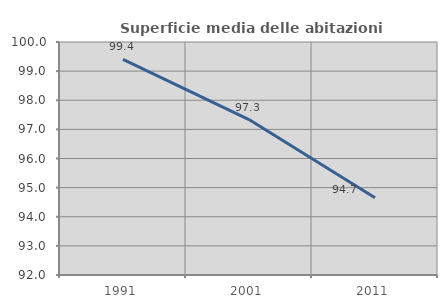
| Category | Superficie media delle abitazioni occupate |
|---|---|
| 1991.0 | 99.405 |
| 2001.0 | 97.338 |
| 2011.0 | 94.654 |